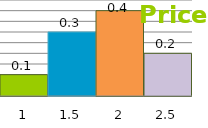
| Category | Series 1 |
|---|---|
| 1.0 | 0.1 |
| 1.5 | 0.3 |
| 2.0 | 0.4 |
| 2.5 | 0.2 |